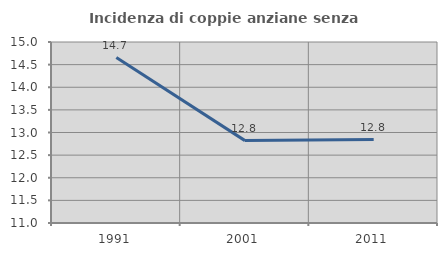
| Category | Incidenza di coppie anziane senza figli  |
|---|---|
| 1991.0 | 14.655 |
| 2001.0 | 12.821 |
| 2011.0 | 12.844 |